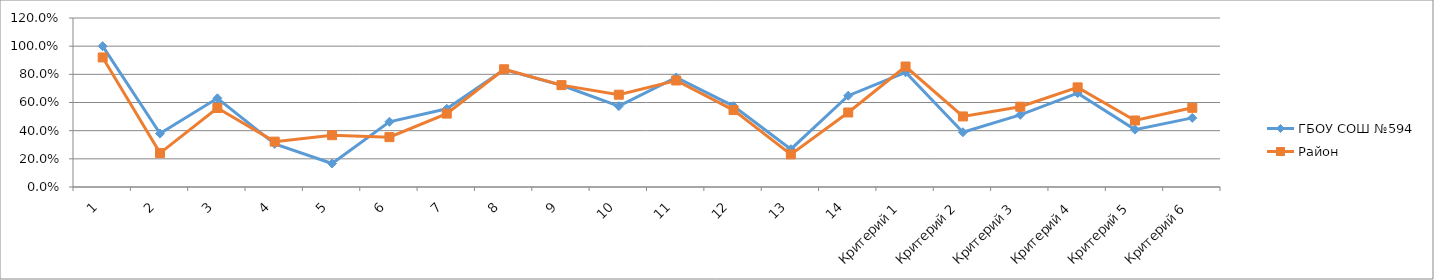
| Category | ГБОУ СОШ №594 | Район |
|---|---|---|
| 1 | 1 | 0.92 |
| 2 | 0.38 | 0.241 |
| 3 | 0.63 | 0.561 |
| 4 | 0.306 | 0.322 |
| 5 | 0.167 | 0.368 |
| 6 | 0.463 | 0.354 |
| 7 | 0.556 | 0.521 |
| 8 | 0.833 | 0.836 |
| 9 | 0.722 | 0.723 |
| 10 | 0.574 | 0.655 |
| 11 | 0.778 | 0.756 |
| 12 | 0.574 | 0.546 |
| 13 | 0.269 | 0.232 |
| 14 | 0.648 | 0.529 |
| Критерий 1 | 0.815 | 0.855 |
| Критерий 2 | 0.389 | 0.501 |
| Критерий 3 | 0.512 | 0.57 |
| Критерий 4 | 0.667 | 0.707 |
| Критерий 5 | 0.407 | 0.472 |
| Критерий 6 | 0.491 | 0.562 |